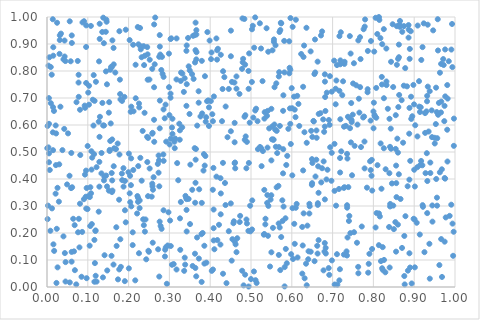
| Category | Series 0 |
|---|---|
| 0.4968577946513707 | 0.609 |
| 0.5550881061138039 | 0.546 |
| 0.9847487433561566 | 0.836 |
| 0.6431036087697605 | 0.308 |
| 0.560895520260671 | 0.519 |
| 0.7932054634017052 | 0.616 |
| 0.34986087633291063 | 0.802 |
| 0.13981476783152402 | 0.598 |
| 0.1283061002384357 | 0.463 |
| 0.9077197810009863 | 0.444 |
| 0.4941223204094912 | 0.734 |
| 0.6655604299139568 | 0.349 |
| 0.9815552704661054 | 0.465 |
| 0.9758297064183665 | 0.88 |
| 0.8135462167911344 | 1 |
| 0.5400764976948562 | 0.34 |
| 0.6792664672527957 | 0.575 |
| 0.5681904242599698 | 0.119 |
| 0.7085083334381591 | 0.301 |
| 0.16988733405716983 | 0.221 |
| 0.635898546188182 | 0.96 |
| 0.8979959596988805 | 0.748 |
| 0.36364871445322056 | 0.071 |
| 0.7167576279590451 | 0.929 |
| 0.8600149066732343 | 0.231 |
| 0.22542611138186142 | 0.125 |
| 0.30353669564046304 | 0.549 |
| 0.00463101264224941 | 0.7 |
| 0.38565714310910026 | 0.153 |
| 0.014162930258101225 | 0.992 |
| 0.5259516448342421 | 0.448 |
| 0.4889222161888189 | 0.25 |
| 0.4855568734444792 | 0.046 |
| 0.6257132816797655 | 0.05 |
| 0.6604443878707552 | 0.58 |
| 0.5466880160662291 | 0.076 |
| 0.963109767108389 | 0.794 |
| 0.9159674868755997 | 0.666 |
| 0.09044429866979653 | 0.325 |
| 0.29061358301128937 | 0.675 |
| 0.9123381777126308 | 0.668 |
| 0.8560548950523381 | 0.385 |
| 0.8692321032748255 | 0.692 |
| 0.26238883056815643 | 0.619 |
| 0.6935326478910392 | 0.781 |
| 0.900042721004159 | 0.434 |
| 0.24856796251531088 | 0.134 |
| 0.7355015903336405 | 0.303 |
| 0.7187898178772685 | 0.825 |
| 0.7354503526950196 | 0.493 |
| 0.5396280121051962 | 0.312 |
| 0.6314562271041632 | 0.032 |
| 0.9015747699556825 | 0.073 |
| 0.2626266738455568 | 0.972 |
| 0.5793616477330763 | 0.71 |
| 0.32426888153558797 | 0.605 |
| 0.5548582471265798 | 0.546 |
| 0.7410162775436046 | 0.263 |
| 0.14444859746966487 | 0.799 |
| 0.8177580675212798 | 0.532 |
| 0.16452808470427716 | 0.514 |
| 0.15161296080298525 | 0.357 |
| 0.258854837632708 | 0.571 |
| 0.02911431612070159 | 0.316 |
| 0.37301811788100225 | 0.362 |
| 0.10889206413125818 | 0.503 |
| 0.5740425036422052 | 0.185 |
| 0.4347135971639656 | 0.777 |
| 0.24957321811517574 | 0.13 |
| 0.6817384478370889 | 0.704 |
| 0.13788709788648912 | 0.997 |
| 0.6904206372281226 | 0.07 |
| 0.18427464242145464 | 0.396 |
| 0.4260070318587683 | 0.346 |
| 0.460795455986338 | 0.461 |
| 0.2765740477530717 | 0.89 |
| 0.9554006012966328 | 0.648 |
| 0.0007282145878694246 | 0.514 |
| 0.1602602589147316 | 0.913 |
| 0.9663046618004675 | 0.687 |
| 0.2885573144865482 | 0.625 |
| 0.38580415912831845 | 0.087 |
| 0.5877634125736021 | 0.088 |
| 0.7842102367208851 | 0.368 |
| 0.7960768939595134 | 0.471 |
| 0.8707392878854093 | 0.945 |
| 0.9268219552007726 | 0.571 |
| 0.9757563897303106 | 0.401 |
| 0.35058183091374984 | 0.233 |
| 0.8575671125733915 | 0.823 |
| 0.8557152571414638 | 0.45 |
| 0.5351314602369093 | 0.232 |
| 0.2751944020553747 | 0.039 |
| 0.6141368366756328 | 0.109 |
| 0.9380268008929219 | 0.725 |
| 0.273564409135445 | 0.487 |
| 0.2988757577171226 | 0.864 |
| 0.8839097143011839 | 0.373 |
| 0.5521082667717908 | 0.595 |
| 0.5160032237752342 | 0.614 |
| 0.5707277165052671 | 0.597 |
| 0.3785244760668295 | 0.195 |
| 0.388177583106856 | 0.485 |
| 0.30283977656882066 | 0.716 |
| 0.8158137773125361 | 0.261 |
| 0.9372531811522724 | 0.16 |
| 0.6097192174409418 | 0.293 |
| 0.09929109349467391 | 0.289 |
| 0.15500845177619083 | 0.541 |
| 0.6183299774847917 | 0.596 |
| 0.4315595950716693 | 0.799 |
| 0.737638363511908 | 0.63 |
| 0.3142490823719034 | 0.55 |
| 0.11615404400689944 | 0.174 |
| 0.3000415241772192 | 0.637 |
| 0.9141799074264136 | 0.648 |
| 0.11218637166731737 | 0.694 |
| 0.5024262345969954 | 0.954 |
| 0.727553283762642 | 0.12 |
| 0.3681898659190176 | 0.598 |
| 0.4978413237116913 | 0.301 |
| 0.6716009815042019 | 0.932 |
| 0.9561045098757347 | 0.301 |
| 0.04923885701959674 | 0.38 |
| 0.001510726746625335 | 0.251 |
| 0.16044637420735308 | 0.357 |
| 0.15880175505615546 | 0.815 |
| 0.5125121257754572 | 0.66 |
| 0.6918382928442575 | 0.045 |
| 0.5717535311366823 | 0.063 |
| 0.20997302182299127 | 0.155 |
| 0.7050474525853521 | 0.009 |
| 0.014359938899657032 | 0.573 |
| 0.35933225286046044 | 0.771 |
| 0.02578795184961069 | 0.367 |
| 0.6636815138223762 | 0.304 |
| 0.553789515514479 | 0.219 |
| 0.38900280755439454 | 0.612 |
| 0.5684668216556712 | 0.518 |
| 0.6823872852944939 | 0.652 |
| 0.09596390225969942 | 0.756 |
| 0.5798492732500447 | 0.298 |
| 0.6830299149191207 | 0.145 |
| 0.28330444489269313 | 0.789 |
| 0.5409249071778184 | 0.652 |
| 0.21212306132991277 | 0.651 |
| 0.6812277269895954 | 0.761 |
| 0.21115086934778893 | 0.897 |
| 0.13943031830435548 | 0.903 |
| 0.21717136283856298 | 0.823 |
| 0.5499650010138571 | 0.128 |
| 0.5112755929949042 | 0.025 |
| 0.6277554627343435 | 0.741 |
| 0.015330769262992483 | 0.857 |
| 0.10986647456823861 | 0.233 |
| 0.8011437941045743 | 0.683 |
| 0.567224994142263 | 0.375 |
| 0.2776841443626682 | 0.861 |
| 0.7630599685704733 | 0.913 |
| 0.34710848376680636 | 0.326 |
| 0.6091441356157488 | 0.629 |
| 0.3795071255998409 | 0.838 |
| 0.8631829406189441 | 0.711 |
| 0.9015969353013954 | 0.372 |
| 0.43755998325049983 | 0.304 |
| 0.48702413291182167 | 0.558 |
| 0.8649184919922205 | 0.964 |
| 0.549946932306608 | 0.469 |
| 0.10298521222793389 | 0.745 |
| 0.5021517313158383 | 0.759 |
| 0.6600893199663431 | 0.471 |
| 0.15715596173813695 | 0.815 |
| 0.0557233697190086 | 0.984 |
| 0.5718419324340145 | 0.952 |
| 0.8353452581994687 | 0.66 |
| 0.8884696879505267 | 0.663 |
| 0.36232284018376715 | 0.933 |
| 0.45051001875005614 | 0.31 |
| 0.2591744537307227 | 0.164 |
| 0.6277971697527903 | 0.432 |
| 0.9118376939794882 | 0.762 |
| 0.4837722640134956 | 0.993 |
| 0.8255767251617624 | 0.955 |
| 0.5355471815773578 | 0.253 |
| 0.8133705186745419 | 0.155 |
| 0.5983954745225107 | 0.122 |
| 0.7048215704010409 | 0.356 |
| 0.2270269755672375 | 0.292 |
| 0.5221010249724684 | 0.519 |
| 0.11854745586311755 | 0.208 |
| 0.7236470740722304 | 0.711 |
| 0.560115744284687 | 0.895 |
| 0.8292233264663219 | 0.054 |
| 0.21148025654390223 | 0.433 |
| 0.32169187398991117 | 0.395 |
| 0.8625396700235317 | 0.851 |
| 0.0246905257226101 | 0.979 |
| 0.738550695859651 | 0.37 |
| 0.10632391141431041 | 0.369 |
| 0.12153492944055355 | 0.02 |
| 0.8384860769760826 | 0.222 |
| 0.9677801238481717 | 0.436 |
| 0.7288973743545843 | 0.826 |
| 0.5170336302821674 | 0.511 |
| 0.8546409891837635 | 0.511 |
| 0.8624485888142088 | 0.898 |
| 0.9910701449387903 | 0.879 |
| 0.1375868802705279 | 0.598 |
| 0.6632076890471778 | 0.124 |
| 0.20367688471174905 | 0.412 |
| 0.302938381303696 | 0.918 |
| 0.8996133291146261 | 0.676 |
| 0.9315003228417326 | 0.688 |
| 0.6801277336023364 | 0.131 |
| 0.0961773292760092 | 0.291 |
| 0.9681543759498176 | 0.037 |
| 0.5044317991190475 | 0.967 |
| 0.07747462760283641 | 0.786 |
| 0.8185434337990403 | 0.096 |
| 0.09511884743672372 | 0.334 |
| 0.4506989371014457 | 0.855 |
| 0.8070323253420635 | 0.627 |
| 0.8623792319626591 | 0.418 |
| 0.548046966350176 | 0.324 |
| 0.16736849332113768 | 0.794 |
| 0.9540303187857487 | 0.4 |
| 0.10489442723251585 | 0.333 |
| 0.4064557454079838 | 0.36 |
| 0.11620575813384215 | 0.02 |
| 0.237992147143553 | 0.822 |
| 0.36607806804782295 | 0.935 |
| 0.6365789728848655 | 0.534 |
| 0.7189665945448231 | 0.621 |
| 0.20065956324418233 | 0.494 |
| 0.7277121056493933 | 0.367 |
| 0.17866237372798155 | 0.768 |
| 0.7408102024333348 | 0.626 |
| 0.1334375205640096 | 0.421 |
| 0.5681634439464562 | 0.78 |
| 0.7674865256072961 | 0.74 |
| 0.7116271274904985 | 0.009 |
| 0.2744692753900272 | 0.469 |
| 0.4083577975687154 | 0.218 |
| 0.24759340522654993 | 0.336 |
| 0.14058045240135175 | 0.409 |
| 0.7685314826122072 | 0.844 |
| 0.04536752540203659 | 0.02 |
| 0.9394989346628463 | 0.461 |
| 0.4455704905348 | 0.734 |
| 0.739975951859305 | 0.245 |
| 0.7525661963795268 | 0.203 |
| 0.8205615113320901 | 0.778 |
| 0.8095530523103295 | 0.937 |
| 0.2851667751724788 | 0.491 |
| 0.3492745642540759 | 0.641 |
| 0.18740094561238585 | 0.44 |
| 0.2062429213815562 | 0.476 |
| 0.058983343915322006 | 0.366 |
| 0.4314063154570984 | 0.049 |
| 0.8407300441023359 | 0.519 |
| 0.17977275300744744 | 0.177 |
| 0.22339895527005804 | 0.33 |
| 0.8000568614351675 | 0.65 |
| 0.5077524793593737 | 0.886 |
| 0.9819691896989583 | 0.698 |
| 0.3417407158339246 | 0.671 |
| 0.40839246663742756 | 0.287 |
| 0.021314636005735244 | 0.598 |
| 0.3659330522282854 | 0.843 |
| 0.4424087849679703 | 0.555 |
| 0.45450442321377993 | 0.177 |
| 0.415193457741697 | 0.921 |
| 0.1774128545613105 | 0.947 |
| 0.7201124564550784 | 0.943 |
| 0.9935522121814403 | 0.814 |
| 0.6638539823513495 | 0.31 |
| 0.8501881447159132 | 0.214 |
| 0.5698502077753113 | 0.945 |
| 0.6659783272289477 | 0.641 |
| 0.8898837102839422 | 0.072 |
| 0.49364753054328636 | 0.208 |
| 0.9353152525597984 | 0.576 |
| 0.581400895587007 | 0.911 |
| 0.1336822934391907 | 0.496 |
| 0.09075857263350162 | 0.984 |
| 0.043035052881448155 | 0.913 |
| 0.6623487006795409 | 0.153 |
| 0.6230354136168857 | 0.863 |
| 0.26282577196682966 | 0.538 |
| 0.20256670439543611 | 0.915 |
| 0.31905057441179385 | 0.459 |
| 0.9773444009718145 | 0.258 |
| 0.1690058408275893 | 0.511 |
| 0.2518121812806723 | 0.842 |
| 0.6099446924147652 | 0.99 |
| 0.8566654608391762 | 0.333 |
| 0.24587333297725034 | 0.463 |
| 0.2580938755844313 | 0.568 |
| 0.7940217922944884 | 0.911 |
| 0.7609864305100857 | 0.601 |
| 0.593611599420853 | 0.91 |
| 0.6983090062255344 | 0.099 |
| 0.3814968121949829 | 0.2 |
| 0.9655803552897778 | 0.646 |
| 0.7191502335720914 | 0.839 |
| 0.04502519721974396 | 0.837 |
| 0.3802894648510169 | 0.643 |
| 0.8171791304285085 | 0.922 |
| 0.5315108382600421 | 0.194 |
| 0.5245560239122139 | 0.515 |
| 0.9908529690046184 | 0.305 |
| 0.009472804619445552 | 0.681 |
| 0.15364576037249522 | 0.508 |
| 0.6498012510890383 | 0.385 |
| 0.6162744500726665 | 0.678 |
| 0.12974441737549758 | 0.63 |
| 0.926646699930322 | 0.644 |
| 0.21742138373344722 | 0.699 |
| 0.14104628749848747 | 0.118 |
| 0.6979552839305495 | 0.497 |
| 0.7107038332910219 | 0.122 |
| 0.8215992045022276 | 0.899 |
| 0.4986673933586596 | 0.206 |
| 0.8398728620485669 | 0.072 |
| 0.09715869108032327 | 0.033 |
| 0.1144540444506652 | 0.785 |
| 0.3266116517073131 | 0.138 |
| 0.37223089654800323 | 0.105 |
| 0.2414966987838456 | 0.25 |
| 0.36577493251473203 | 0.04 |
| 0.5690886220802575 | 0.796 |
| 0.4947464905269765 | 0.459 |
| 0.26528281849622737 | 0.998 |
| 0.008305874972517113 | 0.208 |
| 0.36781428685026185 | 0.183 |
| 0.30639422115226655 | 0.591 |
| 0.3717572936867646 | 0.683 |
| 0.7859185929413038 | 0.733 |
| 0.08702016613245056 | 0.98 |
| 0.19106356790026102 | 0.393 |
| 0.4807253004416706 | 0.845 |
| 0.07775679465526775 | 0.704 |
| 0.2734647914238918 | 0.423 |
| 0.15530229492817027 | 0.805 |
| 0.7038088570120647 | 0.838 |
| 0.6017345807209082 | 0.292 |
| 0.07732151147456401 | 0.757 |
| 0.4170116362306262 | 0.877 |
| 0.40904901209455224 | 0.706 |
| 0.653879311468506 | 0.613 |
| 0.8745806597174972 | 0.746 |
| 0.6769654779379523 | 0.621 |
| 0.28573228306013787 | 0.778 |
| 0.23983799001666728 | 0.857 |
| 0.4289346691051391 | 0.614 |
| 0.7422278767410095 | 0.929 |
| 0.5325827809010928 | 0.196 |
| 0.2895699450271758 | 0.138 |
| 0.4644886262831255 | 0.129 |
| 0.787192529420179 | 0.053 |
| 0.5825553502200783 | 0.074 |
| 0.9953976856668485 | 0.116 |
| 0.7672084209320188 | 0.925 |
| 0.7918549596619472 | 0.466 |
| 0.22162225601312158 | 0.337 |
| 0.1535637042225425 | 0.504 |
| 0.8938525656764646 | 0.013 |
| 0.09965424673033185 | 0.522 |
| 0.9009214154105439 | 0.25 |
| 0.5392477936005542 | 0.634 |
| 0.6530139844842333 | 0.615 |
| 0.3986025148004194 | 0.913 |
| 0.2585035246692601 | 0.373 |
| 0.051563995685488195 | 0.569 |
| 0.32859576136219293 | 0.794 |
| 0.532609771817982 | 0.36 |
| 0.6858552013228274 | 0.72 |
| 0.40211115236132655 | 0.844 |
| 0.040312694244760805 | 0.843 |
| 0.39075944444813804 | 0.09 |
| 0.9747129610929639 | 0.404 |
| 0.015392686452199822 | 0.888 |
| 0.9565221484174492 | 0.551 |
| 0.1591758957291325 | 0.352 |
| 0.24322059407495566 | 0.103 |
| 0.23571323695177604 | 0.251 |
| 0.9234531613572388 | 0.976 |
| 0.8432744770640647 | 0.834 |
| 0.562919602257569 | 0.369 |
| 0.042255424418334186 | 0.586 |
| 0.8078411056158274 | 0.274 |
| 0.5888440026467682 | 0.486 |
| 0.30632692457230415 | 0.082 |
| 0.22414446948510025 | 0.899 |
| 0.5104200548066522 | 0.654 |
| 0.3762309378087906 | 0.632 |
| 0.9199774305986462 | 0.451 |
| 0.9204176288824315 | 0.888 |
| 0.9079183640328965 | 0.558 |
| 0.3969410131167139 | 0.596 |
| 0.9629028180371433 | 0.425 |
| 0.8300176276410864 | 0.436 |
| 0.0808743481995412 | 0.656 |
| 0.37940308268267386 | 0.312 |
| 0.22716258562966984 | 0.321 |
| 0.20063920453071282 | 0.069 |
| 0.5786849777593481 | 0.652 |
| 0.4734057557534276 | 0.263 |
| 0.8135318789233812 | 0.272 |
| 0.5790139244450156 | 0.51 |
| 0.7179536937362463 | 0.066 |
| 0.5865067304598698 | 0.452 |
| 0.7291218314411072 | 0.37 |
| 0.11931057105466158 | 0.042 |
| 0.9169853229897529 | 0.467 |
| 0.9428621522530511 | 0.654 |
| 0.7954773345914348 | 0.412 |
| 0.6429853084536228 | 0.272 |
| 0.4038678844361988 | 0.06 |
| 0.7435314921508962 | 0.2 |
| 0.16352361376732316 | 0.447 |
| 0.04377189381255808 | 0.126 |
| 0.7856709919946282 | 0.721 |
| 0.9586503286274606 | 0.638 |
| 0.7356457393906005 | 0.294 |
| 0.014859659199012776 | 0.507 |
| 0.7092516525684801 | 0.765 |
| 0.7074900584040664 | 0.734 |
| 0.09341377001445406 | 0.664 |
| 0.6494433709360894 | 0.474 |
| 0.17921019620353196 | 0.715 |
| 0.4613584491706828 | 0.44 |
| 0.6030801667897164 | 0.104 |
| 0.8749452073789179 | 0.966 |
| 0.14606344065536137 | 0.982 |
| 0.8785412398901378 | 0.262 |
| 0.32801895207377774 | 0.315 |
| 0.2957400856387131 | 0.154 |
| 0.0930584699838174 | 0.416 |
| 0.10760771159822458 | 0.967 |
| 0.4455505771761764 | 0.207 |
| 0.22611191570588418 | 0.665 |
| 0.17764000468243246 | 0.491 |
| 0.20657046422577285 | 0.668 |
| 0.5102825153234157 | 0.998 |
| 0.16310056255122607 | 0.885 |
| 0.7696087061873234 | 0.518 |
| 0.5703313723708058 | 0.22 |
| 0.4999716038412386 | 0.029 |
| 0.06069389587821494 | 0.932 |
| 0.5946788709807517 | 0.812 |
| 0.5576899697768715 | 0.74 |
| 0.887770798216006 | 0.568 |
| 0.2399811264613707 | 0.205 |
| 0.8866692213620058 | 0.953 |
| 0.08466634518055904 | 0.038 |
| 0.061654796513290644 | 0.369 |
| 0.18004562407191838 | 0.695 |
| 0.9318772570527356 | 0.274 |
| 0.3176122468757513 | 0.921 |
| 0.06035911284456774 | 0.094 |
| 0.8260730799624199 | 0.1 |
| 0.030692795394232197 | 0.863 |
| 0.1523703973426178 | 0.685 |
| 0.7967997182838371 | 0.141 |
| 0.39308020466761506 | 0.944 |
| 0.17064126043751493 | 0.152 |
| 0.762704650938513 | 0.075 |
| 0.03423736183350845 | 0.938 |
| 0.22554332280229883 | 0.68 |
| 0.3650193061398619 | 0.511 |
| 0.5026454864304516 | 0.213 |
| 0.8027662390652974 | 0.637 |
| 0.933338963414736 | 0.742 |
| 0.29376810262677044 | 0.012 |
| 0.7885291748907591 | 0.086 |
| 0.2100819498111074 | 0.203 |
| 0.8408902189112969 | 0.298 |
| 0.939637810825494 | 0.422 |
| 0.12677883814453128 | 0.612 |
| 0.49411023940545484 | 0.002 |
| 0.3715952402112762 | 0.725 |
| 0.9966904738822637 | 0.205 |
| 0.4052016149044483 | 0.64 |
| 0.03131888340833566 | 0.915 |
| 0.7442247840740949 | 0.865 |
| 0.5497564372301725 | 0.34 |
| 0.12761405727625907 | 0.836 |
| 0.8145524174043857 | 0.989 |
| 0.14697074552744738 | 0.751 |
| 0.87799049481547 | 0.811 |
| 0.12831437275534718 | 0.372 |
| 0.8643799973791795 | 0.972 |
| 0.23446285608750472 | 0.578 |
| 0.7796890869003188 | 0.991 |
| 0.7934237330039167 | 0.433 |
| 0.9061392966040958 | 0.238 |
| 0.8100643710818627 | 0.451 |
| 0.8757766877907718 | 0.189 |
| 0.9214709178594802 | 0.297 |
| 0.6365875100599033 | 0.006 |
| 0.6010153017708142 | 0.662 |
| 0.07232180074299455 | 0.684 |
| 0.1907572913861063 | 0.022 |
| 0.6055722301604344 | 0.705 |
| 0.8053913539311488 | 0.22 |
| 0.9661457127153769 | 0.178 |
| 0.24542805505966725 | 0.556 |
| 0.24677128864662778 | 0.768 |
| 0.8003262710814544 | 0.588 |
| 0.3317757947181408 | 0.791 |
| 0.28565332638968133 | 0.658 |
| 0.14767325126946163 | 0.061 |
| 0.10917494915308568 | 0.435 |
| 0.750237024670291 | 0.754 |
| 0.0807968950087028 | 0.308 |
| 0.17324687773234915 | 0.531 |
| 0.744896637587751 | 0.536 |
| 0.33869931259263175 | 0.083 |
| 0.5072025632146702 | 0.058 |
| 0.3643088982187387 | 0.472 |
| 0.7787203117099493 | 0.964 |
| 0.01221645313619979 | 0.291 |
| 0.47824831451825844 | 0.06 |
| 0.4250747903385609 | 0.157 |
| 0.888863231085535 | 0.845 |
| 0.5630180493369678 | 0.578 |
| 0.3174835812689033 | 0.065 |
| 0.5030953479264615 | 0.321 |
| 0.14542886437194014 | 0.99 |
| 0.8881890619573182 | 0.398 |
| 0.3075007656691916 | 0.623 |
| 0.6777933952173553 | 0.062 |
| 0.3472759605656933 | 0.817 |
| 0.8031406865749062 | 0.633 |
| 0.009211697963890653 | 0.815 |
| 0.6849703997735719 | 0.398 |
| 0.4643701812846692 | 0.78 |
| 0.13962966434379087 | 0.395 |
| 0.778448159639674 | 0.439 |
| 0.6701948831598182 | 0.644 |
| 0.22910819474543775 | 0.891 |
| 0.3559565908901492 | 0.36 |
| 0.2761708875337199 | 0.242 |
| 0.5852868070272483 | 0.141 |
| 0.5845236801390483 | 0.254 |
| 0.8214102442212488 | 0.069 |
| 0.7522679994612158 | 0.829 |
| 0.7781115720897681 | 0.539 |
| 0.10793165975681163 | 0.347 |
| 0.48997403134507855 | 0.537 |
| 0.9710932899939745 | 0.844 |
| 0.9085099290600792 | 0.968 |
| 0.0642330987997719 | 0.253 |
| 0.3952888863811157 | 0.691 |
| 0.5967474528477735 | 0.996 |
| 0.04035989496772374 | 0.187 |
| 0.23733326764862406 | 0.229 |
| 0.15984680325675238 | 0.395 |
| 0.6742789034258887 | 0.947 |
| 0.18761400224757885 | 0.372 |
| 0.5336127969210007 | 0.648 |
| 0.5818829087631067 | 0.795 |
| 0.925145145061671 | 0.129 |
| 0.202676590472619 | 0.347 |
| 0.3871217930021219 | 0.781 |
| 0.16299749132248764 | 0.083 |
| 0.5282466091210654 | 0.762 |
| 0.2762869325258428 | 0.933 |
| 0.5963852925050432 | 0.805 |
| 0.3394222743196642 | 0.337 |
| 0.8020577759655961 | 0.872 |
| 0.11530820807969044 | 0.492 |
| 0.8454798968548944 | 0.384 |
| 0.9737516729776592 | 0.614 |
| 0.21631960789239002 | 0.025 |
| 0.5620388683772629 | 0.754 |
| 0.4847287567172657 | 0.545 |
| 0.2911509709413338 | 0.147 |
| 0.9503217571646037 | 0.553 |
| 0.9300600555760259 | 0.65 |
| 0.47805293005760574 | 0.808 |
| 0.2802203150612048 | 0.804 |
| 0.746573614195365 | 0.618 |
| 0.33622546033996603 | 0.06 |
| 0.6722117724890235 | 0.387 |
| 0.28589515391109355 | 0.467 |
| 0.1353966184531903 | 0.945 |
| 0.8258051659256949 | 0.699 |
| 0.42599212581202583 | 0.86 |
| 0.0015471231358428206 | 0.596 |
| 0.17673520454863356 | 0.323 |
| 0.6310119152558131 | 0.573 |
| 0.23670570104748545 | 0.892 |
| 0.20513397845374093 | 0.649 |
| 0.22307955228677623 | 0.315 |
| 0.24560798011583618 | 0.889 |
| 0.03781351768216912 | 0.507 |
| 0.19305380126745675 | 0.953 |
| 0.15982638693765183 | 0.547 |
| 0.8484849307322311 | 0.741 |
| 0.5422901049722599 | 0.871 |
| 0.7325276488896408 | 0.597 |
| 0.606014537079747 | 0.234 |
| 0.40319872882932184 | 0.869 |
| 0.2856659102220608 | 0.284 |
| 0.9206213255616572 | 0.303 |
| 0.07613351770780674 | 0.203 |
| 0.16349082555748717 | 0.825 |
| 0.02239954915146225 | 0.569 |
| 0.05585576314278384 | 0.017 |
| 0.27523801214473975 | 0.373 |
| 0.3313736436677347 | 0.591 |
| 0.7540285046138986 | 0.523 |
| 0.011602195615456834 | 0.786 |
| 0.6633225009354811 | 0.835 |
| 0.4841368187277455 | 0.631 |
| 0.8861958735421084 | 0.924 |
| 0.5137580941408026 | 0.015 |
| 0.698085773484648 | 0.724 |
| 0.3790561181675123 | 0.019 |
| 0.9617161119104242 | 0.081 |
| 0.5381325998005685 | 0.958 |
| 0.2465632850687871 | 0.862 |
| 0.927776962092506 | 0.422 |
| 0.07957247713730908 | 0.147 |
| 0.32781988127406125 | 0.763 |
| 0.3416849501866829 | 0.875 |
| 0.004907112767749577 | 0.495 |
| 0.41754171842343424 | 0.174 |
| 0.5592112447935578 | 0.583 |
| 0.806905884262717 | 0.737 |
| 0.003456628985406218 | 0.517 |
| 0.6810213829152099 | 0.788 |
| 0.2890601683228743 | 0.113 |
| 0.6646630683806771 | 0.447 |
| 0.611931173542132 | 0.308 |
| 0.898588030445793 | 0.253 |
| 0.42522710902567884 | 0.403 |
| 0.4399244411726416 | 0.014 |
| 0.3555407927373124 | 0.788 |
| 0.3569672480578717 | 0.078 |
| 0.0552078054352646 | 0.412 |
| 0.6609295161579406 | 0.553 |
| 0.823031920812819 | 0.063 |
| 0.22084481626803099 | 0.272 |
| 0.4796709113048878 | 0.832 |
| 0.39233800116405126 | 0.688 |
| 0.9444306563932098 | 0.302 |
| 0.004882973043973227 | 0.604 |
| 0.6287260217684614 | 0.852 |
| 0.11666302698685438 | 0.689 |
| 0.5513961513288342 | 0.547 |
| 0.6810554125014743 | 0.324 |
| 0.18391686716673772 | 0.689 |
| 0.8757363853744982 | 0.041 |
| 0.26398914632766524 | 0.825 |
| 0.6463858444701782 | 0.131 |
| 0.20575621475616157 | 0.377 |
| 0.6554752529605773 | 0.789 |
| 0.362660390271094 | 0.123 |
| 0.6557662089750214 | 0.096 |
| 0.2580156891025984 | 0.383 |
| 0.5404950135133257 | 0.516 |
| 0.7184216147972435 | 0.424 |
| 0.5678505297468035 | 0.235 |
| 0.4663142493989051 | 0.181 |
| 0.1441226046614873 | 0.945 |
| 0.3253483800440834 | 0.545 |
| 0.4601811260600951 | 0.168 |
| 0.8472095634775982 | 0.973 |
| 0.6072430209472752 | 0.16 |
| 0.6908754792006125 | 0.619 |
| 0.9809185013505171 | 0.583 |
| 0.7182826601408926 | 0.478 |
| 0.23207102812559288 | 0.394 |
| 0.7760045782158987 | 0.955 |
| 0.3970099336446885 | 0.665 |
| 0.735220043310788 | 0.117 |
| 0.2287882302730676 | 0.478 |
| 0.6808582544257307 | 0.594 |
| 0.40153387996865064 | 0.688 |
| 0.22797579119146894 | 0.959 |
| 0.11392192803542234 | 0.598 |
| 0.5499112411895236 | 0.66 |
| 0.20397685738696214 | 0.314 |
| 0.6410552926437941 | 0.132 |
| 0.014812414474023483 | 0.666 |
| 0.10106846093809674 | 0.72 |
| 0.8766888203504746 | 0.01 |
| 0.3835441159830818 | 0.431 |
| 0.7971286566861822 | 0.357 |
| 0.5741586403619714 | 0.976 |
| 0.41680281046493584 | 0.842 |
| 0.9557546946647383 | 0.331 |
| 0.8928120321728277 | 0.623 |
| 0.9025805649056222 | 0.599 |
| 0.47174943140786807 | 0.715 |
| 0.06044184642037165 | 0.13 |
| 0.521766567294166 | 0.977 |
| 0.09234844058683955 | 0.672 |
| 0.07174315905645012 | 0.01 |
| 0.5998225881445303 | 0.737 |
| 0.27658172573278894 | 0.69 |
| 0.02998843449155386 | 0.454 |
| 0.4532148056788696 | 0.76 |
| 0.1267402137806236 | 0.279 |
| 0.9927878359321696 | 0.974 |
| 0.9436647311389608 | 0.555 |
| 0.003768137109049663 | 0.82 |
| 0.4593693442155644 | 0.757 |
| 0.9136825464453198 | 0.194 |
| 0.3104772903705705 | 0.085 |
| 0.36607454918522664 | 0.951 |
| 0.6874400069426578 | 0.434 |
| 0.6656727389531925 | 0.174 |
| 0.22368588224393593 | 0.448 |
| 0.22247866975004627 | 0.963 |
| 0.18102436214797124 | 0.075 |
| 0.4791342834370461 | 0.995 |
| 0.7749839605130934 | 0.628 |
| 0.1290903997904692 | 0.975 |
| 0.7294141522563233 | 0.834 |
| 0.1028896896892092 | 0.675 |
| 0.9743480924307482 | 0.671 |
| 0.6940879614933735 | 0.518 |
| 0.33756809787325026 | 0.109 |
| 0.981074452161675 | 0.748 |
| 0.3005603847535806 | 0.528 |
| 0.9577148979528921 | 0.992 |
| 0.02320221896836161 | 0.015 |
| 0.5773602547202149 | 0.245 |
| 0.7644235512059321 | 0.697 |
| 0.765654183291732 | 0.646 |
| 0.45074227009930057 | 0.949 |
| 0.9149382257094895 | 0.452 |
| 0.3123491209584791 | 0.538 |
| 0.03139997157201535 | 0.932 |
| 0.15811389636915962 | 0.116 |
| 0.6290136383011006 | 0.273 |
| 0.6833218818872162 | 0.124 |
| 0.30279293336510094 | 0.701 |
| 0.6382349879155285 | 0.227 |
| 0.4066771149685974 | 0.614 |
| 0.9939582110867932 | 0.235 |
| 0.14714031305679787 | 0.372 |
| 0.9760932383900484 | 0.706 |
| 0.8922976558423785 | 0.705 |
| 0.8487361547362565 | 0.302 |
| 0.11916721984560952 | 0.209 |
| 0.4818625990259089 | 0.006 |
| 0.8727509872594028 | 0.534 |
| 0.7456154774991147 | 0.681 |
| 0.7771544968922479 | 0.631 |
| 0.8665241688470066 | 0.326 |
| 0.11990750558313856 | 0.76 |
| 0.9318320792666898 | 0.708 |
| 0.6568609972627807 | 0.917 |
| 0.8915283404096104 | 0.947 |
| 0.5767982090741723 | 0.321 |
| 0.31309317008791404 | 0.514 |
| 0.5823329326523273 | 0.002 |
| 0.08160603718592685 | 0.489 |
| 0.09719314305924964 | 0.367 |
| 0.9382077542725493 | 0.031 |
| 0.03290490651033651 | 0.668 |
| 0.6348881301390904 | 0.086 |
| 0.38654619604325136 | 0.45 |
| 0.17707168552835262 | 0.065 |
| 0.4598850514256785 | 0.536 |
| 0.04555502836302194 | 0.092 |
| 0.9174007935301458 | 0.841 |
| 0.8953118002675758 | 0.632 |
| 0.4312602773157489 | 0.46 |
| 0.4622823566561325 | 0.158 |
| 0.11743930935682911 | 0.089 |
| 0.12915692075879648 | 0.919 |
| 0.3631570844848573 | 0.312 |
| 0.1214547240643098 | 0.444 |
| 0.4580501612301182 | 0.243 |
| 0.5975318649129008 | 0.53 |
| 0.5291755639913783 | 0.503 |
| 0.9746151187083805 | 0.168 |
| 0.0024920741800554813 | 0.301 |
| 0.3259969405417362 | 0.254 |
| 0.13708801627864908 | 0.036 |
| 0.6926512571450746 | 0.601 |
| 0.14496264491172028 | 0.413 |
| 0.5954876643606114 | 0.662 |
| 0.38460610898009506 | 0.492 |
| 0.6012615469262992 | 0.413 |
| 0.5574423039656733 | 0.602 |
| 0.09585670830532877 | 0.889 |
| 0.2566112220889597 | 0.335 |
| 0.8319249229819259 | 0.761 |
| 0.3425465374883284 | 0.751 |
| 0.8425606701274847 | 0.587 |
| 0.2921821507364841 | 0.538 |
| 0.0960523501283399 | 0.969 |
| 0.8198033997626476 | 0.364 |
| 0.2297756477071189 | 0.88 |
| 0.06618547464191638 | 0.132 |
| 0.7427088500316531 | 0.588 |
| 0.31737865048869096 | 0.769 |
| 0.05959375684656476 | 0.496 |
| 0.33743848019472833 | 0.773 |
| 0.805531262559711 | 0.997 |
| 0.12869057923535465 | 0.556 |
| 0.6971666050263929 | 0.393 |
| 0.021116607116727804 | 0.346 |
| 0.43036478316837756 | 0.733 |
| 0.9309281801589178 | 0.496 |
| 0.6020701728060505 | 0.964 |
| 0.8209395677904073 | 0.75 |
| 0.6780788383281484 | 0.465 |
| 0.15857311184884992 | 0.422 |
| 0.19105427587044144 | 0.284 |
| 0.5962438300703378 | 0.604 |
| 0.5915555160515849 | 0.586 |
| 0.843228667260304 | 0.512 |
| 0.41888490575035164 | 0.882 |
| 0.47232843284916093 | 0.241 |
| 0.9447246620067105 | 0.242 |
| 0.023959410437682016 | 0.216 |
| 0.7075162060541679 | 0.677 |
| 0.7864006593556006 | 0.874 |
| 0.7107091582638465 | 0.822 |
| 0.7167649326841993 | 0.726 |
| 0.4078948391168027 | 0.441 |
| 0.9868873626913968 | 0.263 |
| 0.36282130900412624 | 0.832 |
| 0.43625043073521674 | 0.385 |
| 0.8651115332936797 | 0.985 |
| 0.45062995931131133 | 0.577 |
| 0.06834261813403741 | 0.062 |
| 0.7165606706758822 | 0.025 |
| 0.6741926480126643 | 0.44 |
| 0.4901321138934096 | 0.235 |
| 0.07800324581438767 | 0.253 |
| 0.9605537791353338 | 0.682 |
| 0.6580833645543414 | 0.409 |
| 0.9331234502341984 | 0.972 |
| 0.2762973226445664 | 0.588 |
| 0.34578895791774655 | 0.922 |
| 0.5938755108603969 | 0.791 |
| 0.6301207766026686 | 0.894 |
| 0.6402722330312258 | 0.103 |
| 0.4856345490126829 | 0.823 |
| 0.8538209796700096 | 0.24 |
| 0.4526768955193988 | 0.098 |
| 0.7493727777073909 | 0.638 |
| 0.8548371664093184 | 0.636 |
| 0.4887119533748512 | 0.44 |
| 0.06779942133855732 | 0.229 |
| 0.4954729472522703 | 0.865 |
| 0.9583125599038387 | 0.876 |
| 0.0862203222138207 | 0.204 |
| 0.02183058663625348 | 0.451 |
| 0.2784711512894934 | 0.226 |
| 0.6461901845505799 | 0.873 |
| 0.7467350070796218 | 0.611 |
| 0.6808059741674289 | 0.163 |
| 0.017541331001466043 | 0.134 |
| 0.27507983910027123 | 0.853 |
| 0.02593994257408505 | 0.073 |
| 0.9536154883181117 | 0.738 |
| 0.25978940695655384 | 0.36 |
| 0.015718574749274516 | 0.158 |
| 0.406771937287283 | 0.065 |
| 0.29770455856755784 | 0.277 |
| 0.28088650177143426 | 0.215 |
| 0.7363511607938467 | 0.476 |
| 0.7901661460222497 | 0.123 |
| 0.8861198045804037 | 0.97 |
| 0.19304533805719304 | 0.24 |
| 0.3581100971286668 | 0.93 |
| 0.5560992882491648 | 0.908 |
| 0.6132993739132437 | 0.708 |
| 0.11071867322041296 | 0.479 |
| 0.9464882594555609 | 0.95 |
| 0.33540323741124045 | 0.723 |
| 0.24774334952655241 | 0.552 |
| 0.29903043509566696 | 0.74 |
| 0.7342113269126933 | 0.132 |
| 0.5245910540492779 | 0.883 |
| 0.15158132222076348 | 0.646 |
| 0.10456444219518635 | 0.153 |
| 0.2716174742963334 | 0.456 |
| 0.5425857233351497 | 0.3 |
| 0.017068393219721423 | 0.652 |
| 0.8555138185590316 | 0.131 |
| 0.552758688002778 | 0.877 |
| 0.7365672474057122 | 0.183 |
| 0.8902785773820423 | 0.467 |
| 0.1896889109632205 | 0.704 |
| 0.8883155780900118 | 0.125 |
| 0.10139695524055403 | 0.337 |
| 0.28187680327619 | 0.852 |
| 0.5562780310880735 | 0.917 |
| 0.2510828871055739 | 0.768 |
| 0.7476470253972098 | 0.414 |
| 0.8394590336094551 | 0.623 |
| 0.49382094648927854 | 0.8 |
| 0.7046515379997162 | 0.53 |
| 0.7631379717482949 | 0.051 |
| 0.3422806963883297 | 0.325 |
| 0.25792290087481573 | 0.808 |
| 0.6574575274489409 | 0.795 |
| 0.6474827756340876 | 0.578 |
| 0.006765255717117613 | 0.433 |
| 0.1740188855458309 | 0.028 |
| 0.13576639672313373 | 0.682 |
| 0.34099285133640456 | 0.331 |
| 0.8701767996889533 | 0.145 |
| 0.3642001983668811 | 0.979 |
| 0.8845842685286606 | 0.061 |
| 0.9322210198461423 | 0.392 |
| 0.45690967326184495 | 0.236 |
| 0.25163438685073347 | 0.439 |
| 0.23913654655923078 | 0.645 |
| 0.09568072072848932 | 0.431 |
| 0.10598569013872183 | 0.226 |
| 0.7714863134455751 | 0.224 |
| 0.34235175780570504 | 0.206 |
| 0.410255678343872 | 0.14 |
| 0.6255453712234519 | 0.222 |
| 0.231973894461585 | 0.851 |
| 0.43789987655552975 | 0.668 |
| 0.7579102387837116 | 0.747 |
| 0.27237544278044923 | 0.14 |
| 0.19953061029703378 | 0.425 |
| 0.7279021611590104 | 0.594 |
| 0.3640036470760004 | 0.386 |
| 0.7256610953739618 | 0.762 |
| 0.5642453225588876 | 0.496 |
| 0.6505128137226786 | 0.459 |
| 0.005770744249128934 | 0.851 |
| 0.3664230437190732 | 0.87 |
| 0.18354915711863984 | 0.42 |
| 0.8605276597665539 | 0.845 |
| 0.30752697002758167 | 0.567 |
| 0.9529981555659591 | 0.603 |
| 0.822783010076249 | 0.148 |
| 0.6438744534827058 | 0.299 |
| 0.7211858748742822 | 0.502 |
| 0.8611136092876924 | 0.667 |
| 0.40854641049484164 | 0.173 |
| 0.8586690123157751 | 0.549 |
| 0.45987050023912435 | 0.458 |
| 0.3257564447432435 | 0.58 |
| 0.5731423922892492 | 0.978 |
| 0.1562141358550424 | 0.606 |
| 0.30167961893256834 | 0.246 |
| 0.9503908032546049 | 0.532 |
| 0.42152340666894716 | 0.23 |
| 0.30335162735834664 | 0.152 |
| 0.8823887586038219 | 0.743 |
| 0.8411944592015144 | 0.308 |
| 0.6491878481443899 | 0.378 |
| 0.8321716323621408 | 0.748 |
| 0.30459934563669666 | 0.921 |
| 0.965935138477645 | 0.826 |
| 0.3420171569555316 | 0.285 |
| 0.7156407622703422 | 0.363 |
| 0.99738862314392 | 0.624 |
| 0.04324963749646149 | 0.854 |
| 0.36395881453288537 | 0.877 |
| 0.35136999916922107 | 0.453 |
| 0.6267881653371573 | 0.154 |
| 0.26125211550383365 | 0.407 |
| 0.41536771616384016 | 0.409 |
| 0.54457988789463 | 0.587 |
| 0.46441768739372447 | 0.734 |
| 0.5416190699667728 | 0.19 |
| 0.997135115422304 | 0.523 |
| 0.3901546848311168 | 0.629 |
| 0.004829366073125896 | 0.462 |
| 0.342417424359019 | 0.895 |
| 0.8256395038699957 | 0.514 |
| 0.85749778260417 | 0.966 |
| 0.5785580892378605 | 0.421 |
| 0.0581221960630669 | 0.836 |
| 0.2624818020316724 | 0.74 |
| 0.4599302316255701 | 0.608 |
| 0.6071208023769832 | 0.657 |
| 0.7597424203363939 | 0.164 |
| 0.0609097201164952 | 0.904 |
| 0.6503837310474168 | 0.556 |
| 0.4861562808782365 | 0.636 |
| 0.831734419875735 | 0.883 |
| 0.8892980467072589 | 0.882 |
| 0.3619520173079612 | 0.514 |
| 0.425708265056141 | 0.269 |
| 0.5328747628082879 | 0.624 |
| 0.20660393496543195 | 0.299 |
| 0.5056323926974521 | 0.627 |
| 0.97230036229084 | 0.822 |
| 0.8391683411613784 | 0.422 |
| 0.8601356413267837 | 0.498 |
| 0.07537948071795575 | 0.837 |